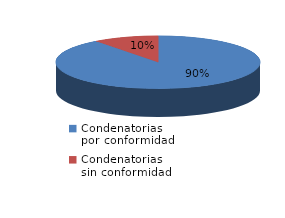
| Category | Series 0 |
|---|---|
| 0 | 173 |
| 1 | 20 |